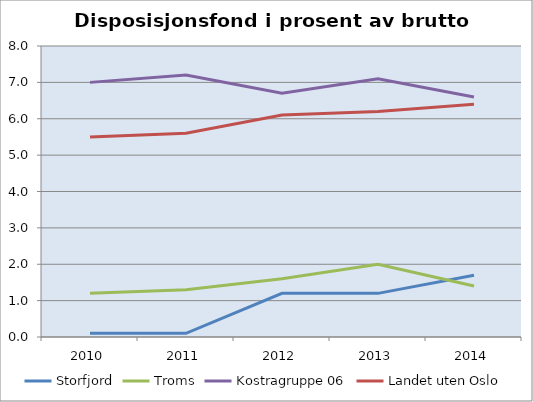
| Category | Storfjord | Troms | Kostragruppe 06 | Landet uten Oslo |
|---|---|---|---|---|
| 2010 | 0.1 | 1.2 | 7 | 5.5 |
| 2011 | 0.1 | 1.3 | 7.2 | 5.6 |
| 2012 | 1.2 | 1.6 | 6.7 | 6.1 |
| 2013 | 1.2 | 2 | 7.1 | 6.2 |
| 2014 | 1.7 | 1.4 | 6.6 | 6.4 |